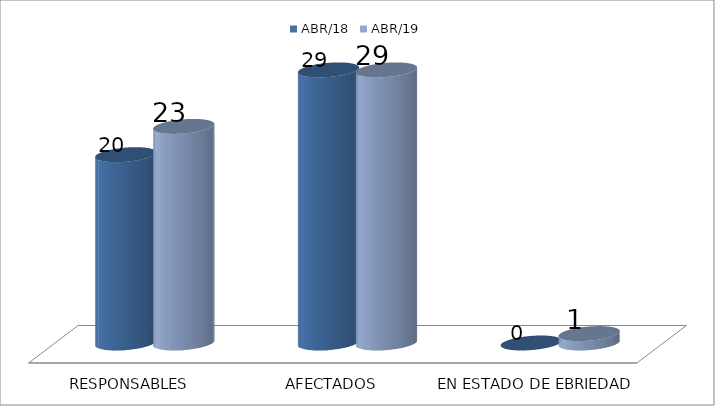
| Category | ABR/18 | ABR/19 |
|---|---|---|
| RESPONSABLES | 20 | 23 |
| AFECTADOS | 29 | 29 |
| EN ESTADO DE EBRIEDAD | 0 | 1 |